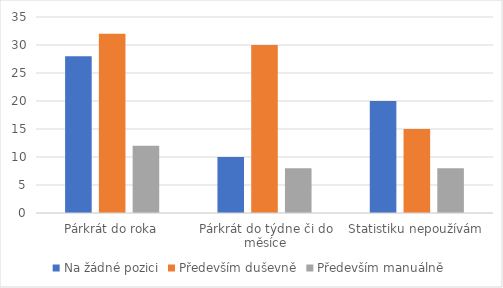
| Category | Na žádné pozici | Především duševně | Především manuálně |
|---|---|---|---|
| Párkrát do roka | 28 | 32 | 12 |
| Párkrát do týdne či do měsíce | 10 | 30 | 8 |
| Statistiku nepoužívám | 20 | 15 | 8 |